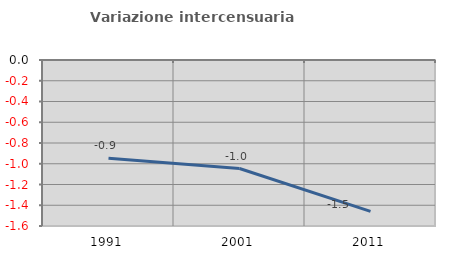
| Category | Variazione intercensuaria annua |
|---|---|
| 1991.0 | -0.947 |
| 2001.0 | -1.046 |
| 2011.0 | -1.459 |